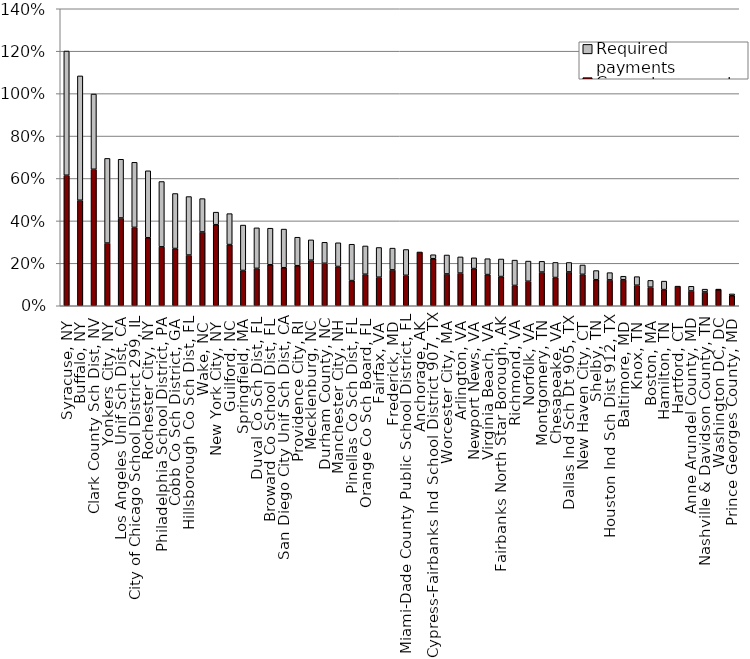
| Category | Current payments | Required payments |
|---|---|---|
| Syracuse, NY | 0.615 | 0.586 |
| Buffalo, NY | 0.497 | 0.586 |
| Clark County Sch Dist, NV | 0.643 | 0.355 |
| Yonkers City, NY | 0.295 | 0.399 |
| Los Angeles Unif Sch Dist, CA | 0.414 | 0.277 |
| City of Chicago School District 299, IL | 0.369 | 0.307 |
| Rochester City, NY | 0.321 | 0.316 |
| Philadelphia School District, PA | 0.278 | 0.308 |
| Cobb Co Sch District, GA | 0.27 | 0.259 |
| Hillsborough Co Sch Dist, FL | 0.239 | 0.276 |
| Wake, NC | 0.348 | 0.157 |
| New York City, NY | 0.382 | 0.059 |
| Guilford, NC | 0.288 | 0.146 |
| Springfield, MA | 0.166 | 0.214 |
| Duval Co Sch Dist, FL | 0.176 | 0.191 |
| Broward Co School Dist, FL | 0.193 | 0.172 |
| San Diego City Unif Sch Dist, CA | 0.179 | 0.182 |
| Providence City, RI | 0.189 | 0.134 |
| Mecklenburg, NC | 0.215 | 0.096 |
| Durham County, NC | 0.2 | 0.099 |
| Manchester City, NH | 0.185 | 0.112 |
| Pinellas Co Sch Dist, FL | 0.119 | 0.171 |
| Orange Co Sch Board, FL | 0.149 | 0.133 |
| Fairfax, VA | 0.135 | 0.14 |
| Frederick, MD | 0.169 | 0.103 |
| Miami-Dade County Public School District, FL | 0.143 | 0.122 |
| Anchorage, AK | 0.254 | 0 |
| Cypress-Fairbanks Ind School District 907, TX | 0.222 | 0.019 |
| Worcester City, MA | 0.15 | 0.089 |
| Arlington, VA | 0.154 | 0.076 |
| Newport News, VA | 0.175 | 0.051 |
| Virginia Beach, VA | 0.147 | 0.075 |
| Fairbanks North Star Borough, AK | 0.138 | 0.083 |
| Richmond, VA | 0.096 | 0.119 |
| Norfolk, VA | 0.116 | 0.095 |
| Montgomery, TN | 0.159 | 0.051 |
| Chesapeake, VA | 0.133 | 0.071 |
| Dallas Ind Sch Dt 905, TX | 0.159 | 0.045 |
| New Haven City, CT | 0.148 | 0.044 |
| Shelby, TN | 0.123 | 0.043 |
| Houston Ind Sch Dist 912, TX | 0.122 | 0.034 |
| Baltimore, MD | 0.122 | 0.017 |
| Knox, TN | 0.097 | 0.04 |
| Boston, MA | 0.088 | 0.032 |
| Hamilton, TN | 0.076 | 0.04 |
| Hartford, CT | 0.093 | 0 |
| Anne Arundel County, MD | 0.07 | 0.022 |
| Nashville & Davidson County, TN | 0.065 | 0.013 |
| Washington DC, DC | 0.076 | 0 |
| Prince Georges County, MD | 0.047 | 0.008 |